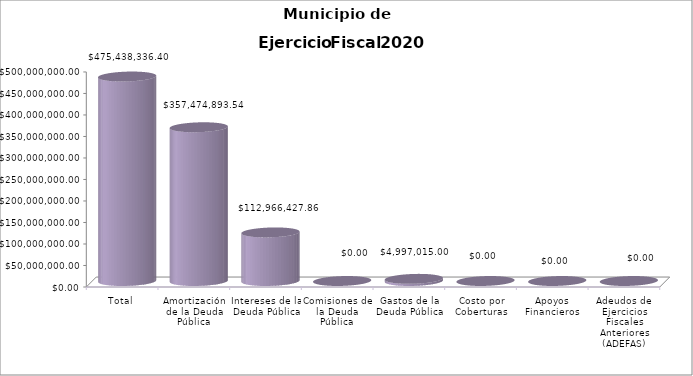
| Category | Municipio de Guadalajara
Deuda Pública 2020 |
|---|---|
| Total | 475438336.4 |
| Amortización de la Deuda Pública | 357474893.54 |
| Intereses de la Deuda Pública | 112966427.86 |
| Comisiones de la Deuda Pública | 0 |
| Gastos de la Deuda Pública | 4997015 |
| Costo por Coberturas | 0 |
| Apoyos Financieros | 0 |
| Adeudos de Ejercicios Fiscales Anteriores (ADEFAS) | 0 |